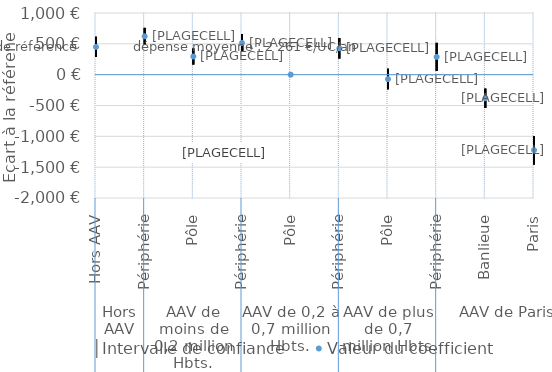
| Category | │Intervalle de confiance | Series 1 | Valeur du coefficient |
|---|---|---|---|
| 0 | 616 | 285 | 450 |
| 1 | 759 | 485 | 622 |
| 2 | 426 | 164 | 295 |
| 3 | 660 | 369 | 514 |
| 4 | 0 | 0 | 0 |
| 5 | 595 | 262 | 428 |
| 6 | 94 | -238 | -72 |
| 7 | 516 | 60 | 288 |
| 8 | -226 | -540 | -383 |
| 9 | -994 | -1455 | -1225 |